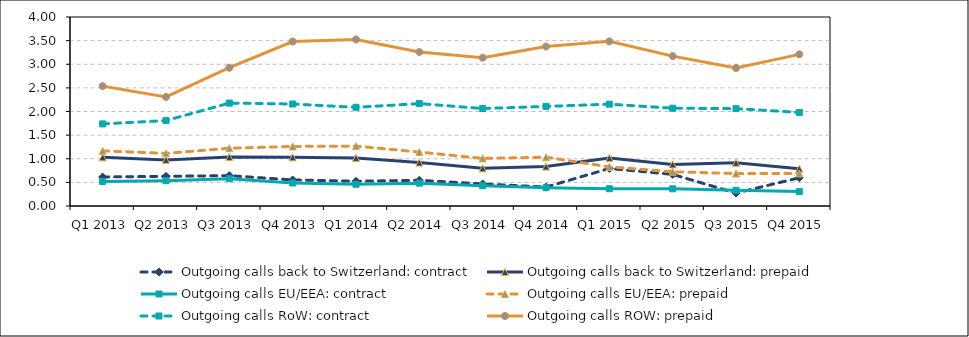
| Category | Outgoing calls back to Switzerland: contract | Outgoing calls back to Switzerland: prepaid | Outgoing calls EU/EEA: contract | Outgoing calls EU/EEA: prepaid | Outgoing calls RoW: contract | Outgoing calls ROW: prepaid |
|---|---|---|---|---|---|---|
| Q1 2013 | 0.615 | 1.031 | 0.518 | 1.167 | 1.738 | 2.537 |
| Q2 2013 | 0.628 | 0.976 | 0.536 | 1.114 | 1.808 | 2.308 |
| Q3 2013 | 0.643 | 1.034 | 0.577 | 1.223 | 2.178 | 2.926 |
| Q4 2013 | 0.552 | 1.031 | 0.486 | 1.26 | 2.158 | 3.48 |
| Q1 2014 | 0.524 | 1.018 | 0.459 | 1.268 | 2.088 | 3.524 |
| Q2 2014 | 0.545 | 0.92 | 0.483 | 1.141 | 2.167 | 3.26 |
| Q3 2014 | 0.467 | 0.798 | 0.429 | 1.007 | 2.063 | 3.138 |
| Q4 2014 | 0.401 | 0.834 | 0.386 | 1.032 | 2.107 | 3.376 |
| Q1 2015 | 0.794 | 1.018 | 0.365 | 0.827 | 2.156 | 3.485 |
| Q2 2015 | 0.669 | 0.881 | 0.364 | 0.725 | 2.069 | 3.172 |
| Q3 2015 | 0.274 | 0.914 | 0.332 | 0.686 | 2.061 | 2.921 |
| Q4 2015 | 0.598 | 0.79 | 0.304 | 0.69 | 1.981 | 3.21 |